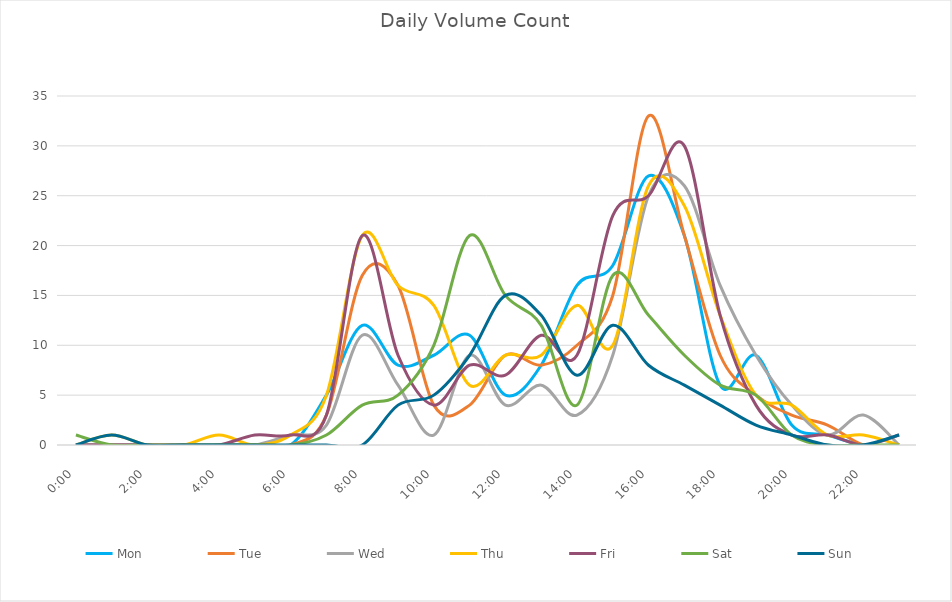
| Category | Mon | Tue | Wed | Thu | Fri | Sat | Sun |
|---|---|---|---|---|---|---|---|
| 0.0 | 0 | 0 | 0 | 0 | 0 | 1 | 0 |
| 0.0416666666666667 | 0 | 0 | 0 | 1 | 0 | 0 | 1 |
| 0.0833333333333333 | 0 | 0 | 0 | 0 | 0 | 0 | 0 |
| 0.125 | 0 | 0 | 0 | 0 | 0 | 0 | 0 |
| 0.166666666666667 | 0 | 0 | 0 | 1 | 0 | 0 | 0 |
| 0.208333333333333 | 0 | 0 | 0 | 0 | 1 | 0 | 0 |
| 0.25 | 0 | 0 | 1 | 1 | 1 | 0 | 0 |
| 0.291666666666667 | 5 | 3 | 2 | 5 | 3 | 1 | 0 |
| 0.333333333333333 | 12 | 17 | 11 | 21 | 21 | 4 | 0 |
| 0.375 | 8 | 16 | 6 | 16 | 9 | 5 | 4 |
| 0.416666666666667 | 9 | 4 | 1 | 14 | 4 | 10 | 5 |
| 0.4583333333333333 | 11 | 4 | 9 | 6 | 8 | 21 | 9 |
| 0.5 | 5 | 9 | 4 | 9 | 7 | 15 | 15 |
| 0.541666666666667 | 8 | 8 | 6 | 9 | 11 | 12 | 13 |
| 0.5833333333333334 | 16 | 10 | 3 | 14 | 9 | 4 | 7 |
| 0.625 | 18 | 15 | 9 | 10 | 23 | 17 | 12 |
| 0.666666666666667 | 27 | 33 | 25 | 26 | 25 | 13 | 8 |
| 0.7083333333333334 | 21 | 21 | 26 | 24 | 30 | 9 | 6 |
| 0.75 | 6 | 9 | 16 | 13 | 13 | 6 | 4 |
| 0.791666666666667 | 9 | 5 | 9 | 5 | 4 | 5 | 2 |
| 0.8333333333333334 | 2 | 3 | 4 | 4 | 1 | 1 | 1 |
| 0.875 | 1 | 2 | 1 | 1 | 1 | 0 | 0 |
| 0.916666666666667 | 0 | 0 | 3 | 1 | 0 | 0 | 0 |
| 0.9583333333333334 | 0 | 0 | 0 | 0 | 1 | 0 | 1 |